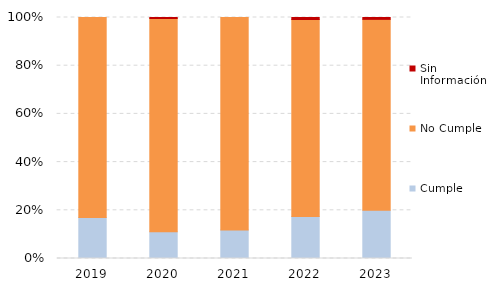
| Category | Cumple | No Cumple | Sin Información |
|---|---|---|---|
| 2019.0 | 41 | 200 | 0 |
| 2020.0 | 27 | 216 | 1 |
| 2021.0 | 30 | 223 | 0 |
| 2022.0 | 42 | 197 | 2 |
| 2023.0 | 52 | 206 | 2 |